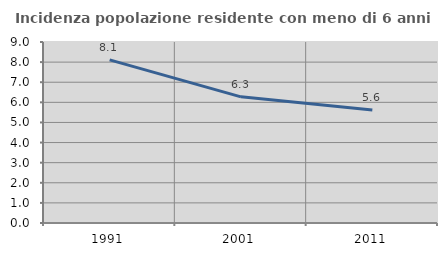
| Category | Incidenza popolazione residente con meno di 6 anni |
|---|---|
| 1991.0 | 8.112 |
| 2001.0 | 6.273 |
| 2011.0 | 5.624 |